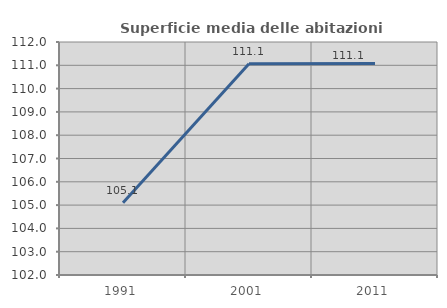
| Category | Superficie media delle abitazioni occupate |
|---|---|
| 1991.0 | 105.1 |
| 2001.0 | 111.069 |
| 2011.0 | 111.08 |